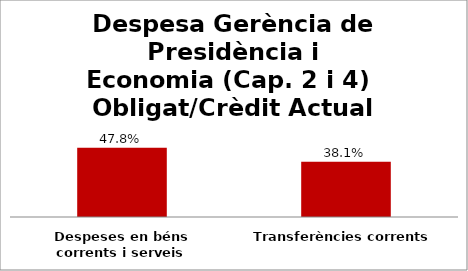
| Category | Series 0 |
|---|---|
| Despeses en béns corrents i serveis | 0.478 |
| Transferències corrents | 0.381 |